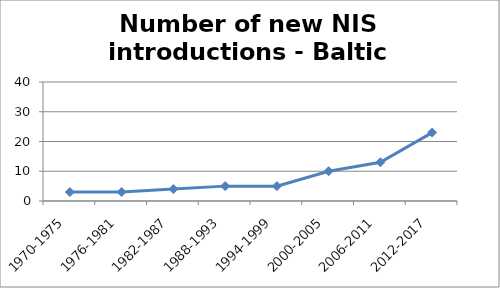
| Category | Number of new NIS introductions - Baltic Sea |
|---|---|
| 1970-1975 | 3 |
| 1976-1981 | 3 |
| 1982-1987 | 4 |
| 1988-1993 | 5 |
| 1994-1999 | 5 |
| 2000-2005 | 10 |
| 2006-2011 | 13 |
| 2012-2017 | 23 |